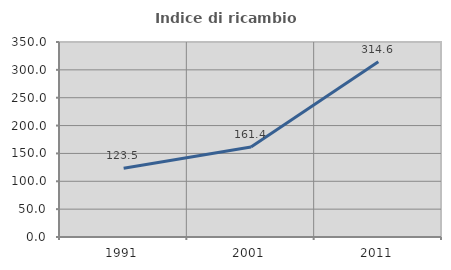
| Category | Indice di ricambio occupazionale  |
|---|---|
| 1991.0 | 123.529 |
| 2001.0 | 161.404 |
| 2011.0 | 314.57 |